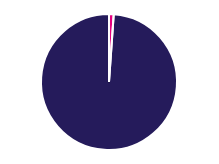
| Category | Series 0 |
|---|---|
| 0 | 3196 |
| 1 | 284941 |